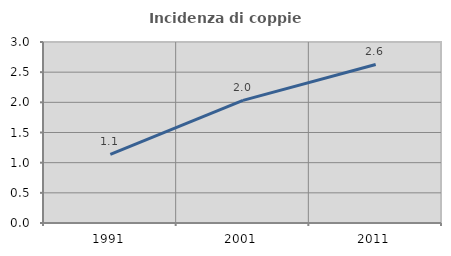
| Category | Incidenza di coppie miste |
|---|---|
| 1991.0 | 1.137 |
| 2001.0 | 2.033 |
| 2011.0 | 2.628 |